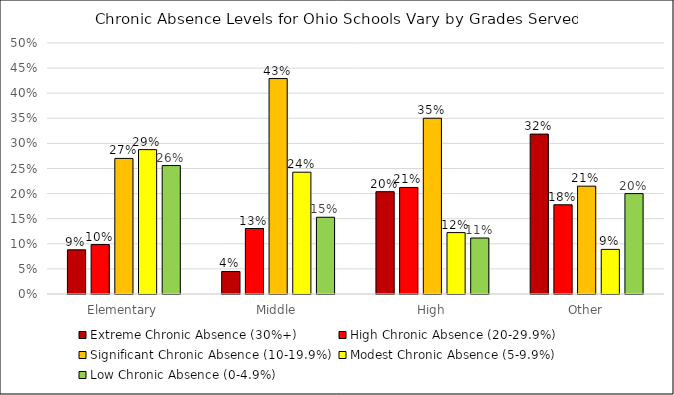
| Category | Extreme Chronic Absence (30%+) | High Chronic Absence (20-29.9%) | Significant Chronic Absence (10-19.9%) | Modest Chronic Absence (5-9.9%) | Low Chronic Absence (0-4.9%) |
|---|---|---|---|---|---|
| Elementary | 0.088 | 0.098 | 0.27 | 0.288 | 0.256 |
| Middle | 0.045 | 0.13 | 0.429 | 0.243 | 0.153 |
| High | 0.204 | 0.212 | 0.35 | 0.122 | 0.112 |
| Other | 0.319 | 0.178 | 0.215 | 0.089 | 0.2 |